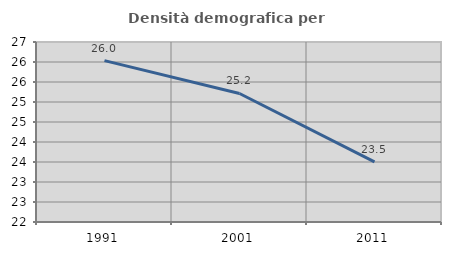
| Category | Densità demografica |
|---|---|
| 1991.0 | 26.035 |
| 2001.0 | 25.213 |
| 2011.0 | 23.503 |